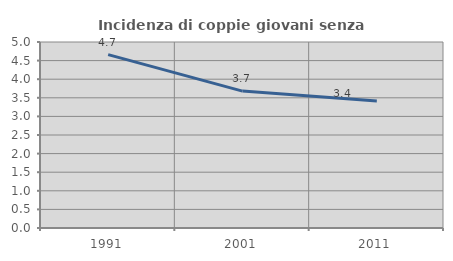
| Category | Incidenza di coppie giovani senza figli |
|---|---|
| 1991.0 | 4.66 |
| 2001.0 | 3.68 |
| 2011.0 | 3.415 |